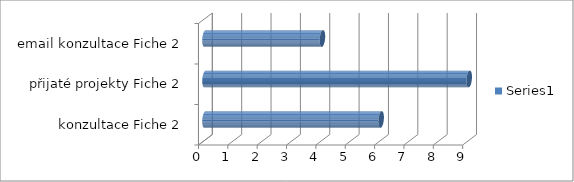
| Category | Series 0 |
|---|---|
|  konzultace Fiche 2 | 6 |
| přijaté projekty Fiche 2 | 9 |
| email konzultace Fiche 2 | 4 |